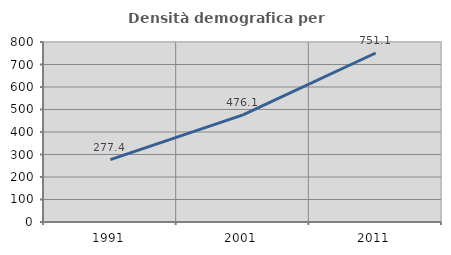
| Category | Densità demografica |
|---|---|
| 1991.0 | 277.382 |
| 2001.0 | 476.094 |
| 2011.0 | 751.102 |